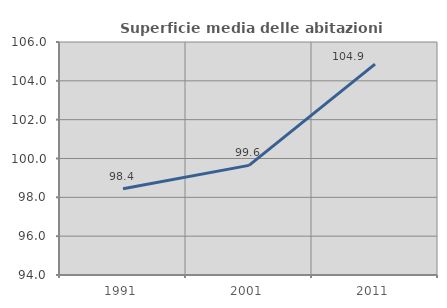
| Category | Superficie media delle abitazioni occupate |
|---|---|
| 1991.0 | 98.447 |
| 2001.0 | 99.645 |
| 2011.0 | 104.863 |